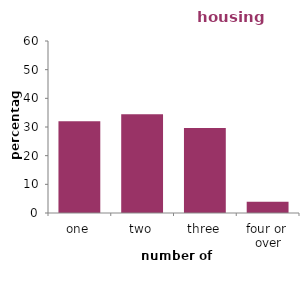
| Category | housing association |
|---|---|
| one | 31.991 |
| two | 34.46 |
| three | 29.643 |
| four or 
over | 3.906 |